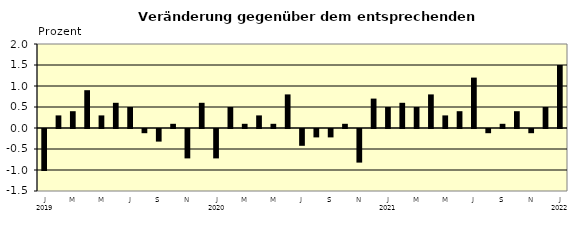
| Category | Series 0 |
|---|---|
| 0 | -1 |
| 1 | 0.3 |
| 2 | 0.4 |
| 3 | 0.9 |
| 4 | 0.3 |
| 5 | 0.6 |
| 6 | 0.5 |
| 7 | -0.1 |
| 8 | -0.3 |
| 9 | 0.1 |
| 10 | -0.7 |
| 11 | 0.6 |
| 12 | -0.7 |
| 13 | 0.5 |
| 14 | 0.1 |
| 15 | 0.3 |
| 16 | 0.1 |
| 17 | 0.8 |
| 18 | -0.4 |
| 19 | -0.2 |
| 20 | -0.2 |
| 21 | 0.1 |
| 22 | -0.8 |
| 23 | 0.7 |
| 24 | 0.5 |
| 25 | 0.6 |
| 26 | 0.5 |
| 27 | 0.8 |
| 28 | 0.3 |
| 29 | 0.4 |
| 30 | 1.2 |
| 31 | -0.1 |
| 32 | 0.1 |
| 33 | 0.4 |
| 34 | -0.1 |
| 35 | 0.5 |
| 36 | 1.5 |